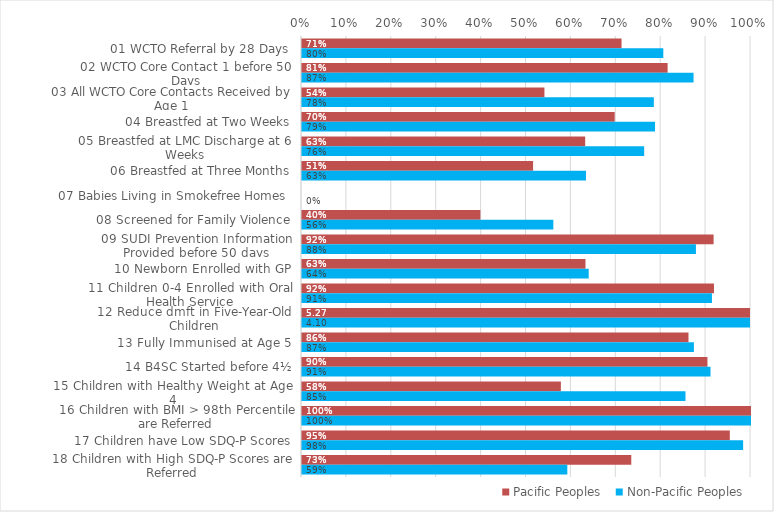
| Category | Pacific Peoples | Non-Pacific Peoples |
|---|---|---|
| 01 WCTO Referral by 28 Days | 0.712 | 0.805 |
| 02 WCTO Core Contact 1 before 50 Days | 0.814 | 0.872 |
| 03 All WCTO Core Contacts Received by Age 1 | 0.54 | 0.784 |
| 04 Breastfed at Two Weeks | 0.696 | 0.786 |
| 05 Breastfed at LMC Discharge at 6 Weeks | 0.631 | 0.762 |
| 06 Breastfed at Three Months | 0.515 | 0.633 |
| 07 Babies Living in Smokefree Homes  | 0 | 0 |
| 08 Screened for Family Violence | 0.397 | 0.56 |
| 09 SUDI Prevention Information Provided before 50 days | 0.917 | 0.877 |
| 10 Newborn Enrolled with GP | 0.631 | 0.639 |
| 11 Children 0-4 Enrolled with Oral Health Service | 0.918 | 0.913 |
| 12 Reduce dmft in Five-Year-Old Children | 5.267 | 4.096 |
| 13 Fully Immunised at Age 5 | 0.861 | 0.873 |
| 14 B4SC Started before 4½ | 0.903 | 0.91 |
| 15 Children with Healthy Weight at Age 4 | 0.577 | 0.854 |
| 16 Children with BMI > 98th Percentile are Referred | 1 | 1 |
| 17 Children have Low SDQ-P Scores | 0.953 | 0.982 |
| 18 Children with High SDQ-P Scores are Referred | 0.733 | 0.591 |